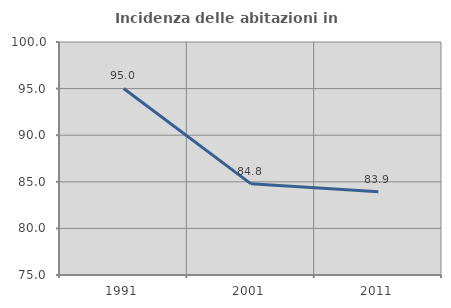
| Category | Incidenza delle abitazioni in proprietà  |
|---|---|
| 1991.0 | 95.015 |
| 2001.0 | 84.783 |
| 2011.0 | 83.924 |